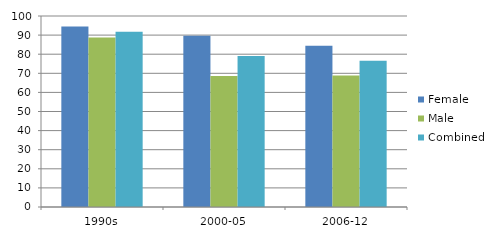
| Category | Female | Male | Combined |
|---|---|---|---|
| 1990s | 94.5 | 88.8 | 91.7 |
| 2000-05 | 89.6 | 68.6 | 79.1 |
| 2006-12 | 84.4 | 68.8 | 76.6 |